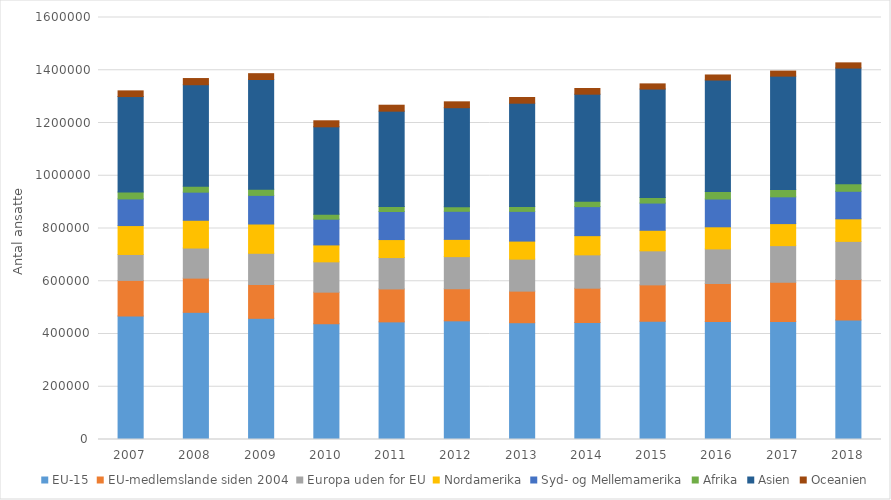
| Category | EU-15 | EU-medlemslande siden 2004 | Europa uden for EU | Nordamerika | Syd- og Mellemamerika | Afrika | Asien | Oceanien |
|---|---|---|---|---|---|---|---|---|
| 2007 | 468563 | 134650 | 98326 | 109569 | 101065 | 26061 | 361997 | 21590 |
| 2008 | 482181 | 129653 | 114116 | 105254 | 106553 | 22695 | 384681 | 23465 |
| 2009 | 459511 | 128138 | 118357 | 111025 | 108589 | 23323 | 415920 | 22154 |
| 2010 | 438903 | 119723 | 114977 | 64155 | 97577 | 19077 | 331155 | 22828 |
| 2011 | 445988 | 124766 | 119093 | 68190 | 106408 | 18949 | 361457 | 22583 |
| 2012 | 449964 | 121598 | 121778 | 65435 | 106461 | 17644 | 375044 | 22327 |
| 2013 | 442788 | 119734 | 121360 | 68382 | 112655 | 18859 | 391286 | 21554 |
| 2014 | 443466 | 130210 | 126419 | 72783 | 110075 | 20815 | 405476 | 21623 |
| 2015 | 448102 | 138153 | 129081 | 77972 | 103143 | 21094 | 411189 | 19584 |
| 2016 | 447205 | 144253 | 131144 | 83869 | 105372 | 28281 | 422840 | 19104 |
| 2017 | 447157 | 149323 | 138572 | 83542 | 101528 | 27973 | 429585 | 19166 |
| 2018 | 453481 | 153370 | 144303 | 85565 | 104357 | 28474 | 438753 | 19719 |